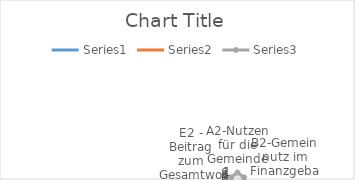
| Category | Series 0 | Series 1 | Series 2 |
|---|---|---|---|
| A2-Nutzen für die Gemeinde | 0 | 0 | 10 |
| B2-Gemeinnutz im Finanzgebaren | 0 | 0 | 10 |
| C2-Gemeinsame Zielvereinbarung für das Gemeinwohl | 0 | 0 | 10 |
| D2-Gesamtwohl in der Gemeinde | 0 | 0 | 10 |
| E2 - Beitrag zum Gesamtwohl | 0 | 0 | 10 |